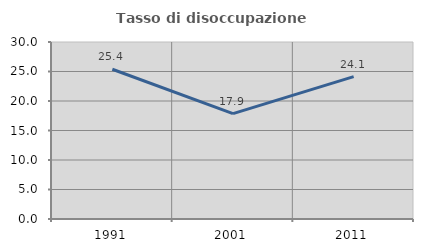
| Category | Tasso di disoccupazione giovanile  |
|---|---|
| 1991.0 | 25.381 |
| 2001.0 | 17.857 |
| 2011.0 | 24.138 |